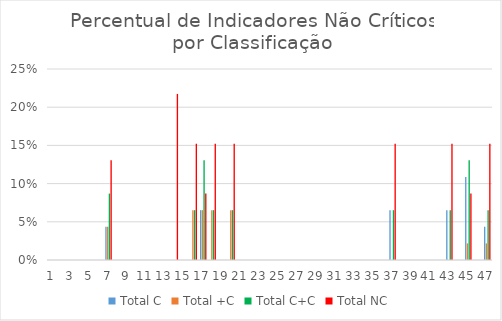
| Category | Total C | Total +C | Total C+C | Total NC |
|---|---|---|---|---|
| 0 | 0 | 0 | 0 | 0 |
| 1 | 0 | 0 | 0 | 0 |
| 2 | 0 | 0 | 0 | 0 |
| 3 | 0 | 0 | 0 | 0 |
| 4 | 0 | 0 | 0 | 0 |
| 5 | 0 | 0 | 0 | 0 |
| 6 | 0.043 | 0.043 | 0.087 | 0.13 |
| 7 | 0 | 0 | 0 | 0 |
| 8 | 0 | 0 | 0 | 0 |
| 9 | 0 | 0 | 0 | 0 |
| 10 | 0 | 0 | 0 | 0 |
| 11 | 0 | 0 | 0 | 0 |
| 12 | 0 | 0 | 0 | 0 |
| 13 | 0 | 0 | 0 | 0.217 |
| 14 | 0 | 0 | 0 | 0 |
| 15 | 0 | 0.065 | 0.065 | 0.152 |
| 16 | 0.065 | 0.065 | 0.13 | 0.087 |
| 17 | 0 | 0.065 | 0.065 | 0.152 |
| 18 | 0 | 0 | 0 | 0 |
| 19 | 0 | 0.065 | 0.065 | 0.152 |
| 20 | 0 | 0 | 0 | 0 |
| 21 | 0 | 0 | 0 | 0 |
| 22 | 0 | 0 | 0 | 0 |
| 23 | 0 | 0 | 0 | 0 |
| 24 | 0 | 0 | 0 | 0 |
| 25 | 0 | 0 | 0 | 0 |
| 26 | 0 | 0 | 0 | 0 |
| 27 | 0 | 0 | 0 | 0 |
| 28 | 0 | 0 | 0 | 0 |
| 29 | 0 | 0 | 0 | 0 |
| 30 | 0 | 0 | 0 | 0 |
| 31 | 0 | 0 | 0 | 0 |
| 32 | 0 | 0 | 0 | 0 |
| 33 | 0 | 0 | 0 | 0 |
| 34 | 0 | 0 | 0 | 0 |
| 35 | 0 | 0 | 0 | 0 |
| 36 | 0.065 | 0 | 0.065 | 0.152 |
| 37 | 0 | 0 | 0 | 0 |
| 38 | 0 | 0 | 0 | 0 |
| 39 | 0 | 0 | 0 | 0 |
| 40 | 0 | 0 | 0 | 0 |
| 41 | 0 | 0 | 0 | 0 |
| 42 | 0.065 | 0 | 0.065 | 0.152 |
| 43 | 0 | 0 | 0 | 0 |
| 44 | 0.109 | 0.022 | 0.13 | 0.087 |
| 45 | 0 | 0 | 0 | 0 |
| 46 | 0.043 | 0.022 | 0.065 | 0.152 |